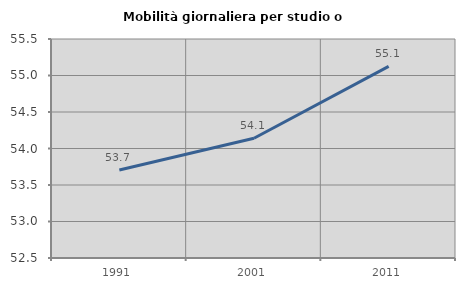
| Category | Mobilità giornaliera per studio o lavoro |
|---|---|
| 1991.0 | 53.705 |
| 2001.0 | 54.14 |
| 2011.0 | 55.125 |